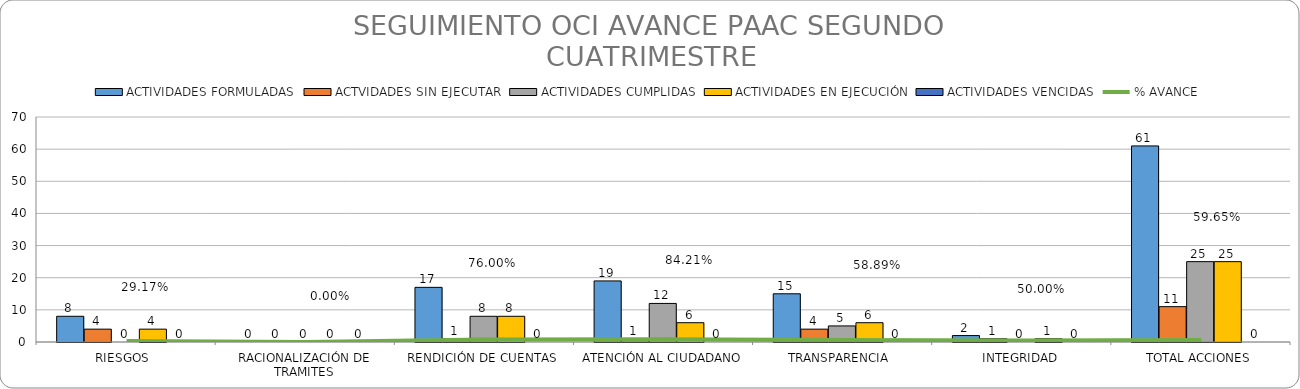
| Category | ACTIVIDADES FORMULADAS | ACTVIDADES SIN EJECUTAR | ACTIVIDADES CUMPLIDAS | ACTIVIDADES EN EJECUCIÓN | ACTIVIDADES VENCIDAS |
|---|---|---|---|---|---|
| RIESGOS  | 8 | 4 | 0 | 4 | 0 |
| RACIONALIZACIÓN DE TRAMITES | 0 | 0 | 0 | 0 | 0 |
| RENDICIÓN DE CUENTAS | 17 | 1 | 8 | 8 | 0 |
| ATENCIÓN AL CIUDADANO | 19 | 1 | 12 | 6 | 0 |
| TRANSPARENCIA  | 15 | 4 | 5 | 6 | 0 |
| INTEGRIDAD | 2 | 1 | 0 | 1 | 0 |
| TOTAL ACCIONES | 61 | 11 | 25 | 25 | 0 |